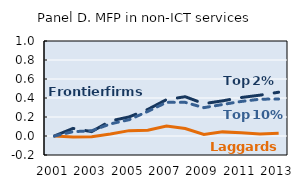
| Category | Series 0 | Series 1 | Series 2 |
|---|---|---|---|
| 2001.0 | 0 | 0 | 0 |
| 2002.0 | 0.08 | -0.01 | 0.046 |
| 2003.0 | 0.046 | -0.008 | 0.055 |
| 2004.0 | 0.158 | 0.02 | 0.127 |
| 2005.0 | 0.201 | 0.056 | 0.171 |
| 2006.0 | 0.28 | 0.061 | 0.259 |
| 2007.0 | 0.383 | 0.106 | 0.354 |
| 2008.0 | 0.413 | 0.08 | 0.354 |
| 2009.0 | 0.34 | 0.017 | 0.298 |
| 2010.0 | 0.37 | 0.043 | 0.332 |
| 2011.0 | 0.405 | 0.034 | 0.364 |
| 2012.0 | 0.43 | 0.022 | 0.388 |
| 2013.0 | 0.461 | 0.029 | 0.389 |